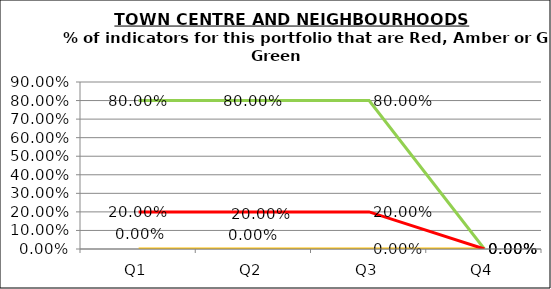
| Category | Green | Amber | Red |
|---|---|---|---|
| Q1 | 0.8 | 0 | 0.2 |
| Q2 | 0.8 | 0 | 0.2 |
| Q3 | 0.8 | 0 | 0.2 |
| Q4 | 0 | 0 | 0 |